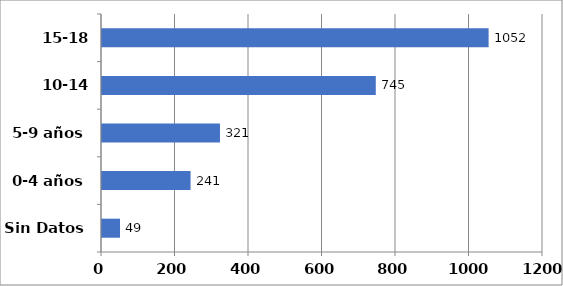
| Category | Series 0 |
|---|---|
| Sin Datos | 49 |
| 0-4 años | 241 |
| 5-9 años | 321 |
| 10-14 años | 745 |
| 15-18 años | 1052 |